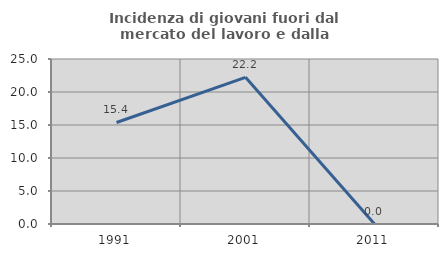
| Category | Incidenza di giovani fuori dal mercato del lavoro e dalla formazione  |
|---|---|
| 1991.0 | 15.385 |
| 2001.0 | 22.222 |
| 2011.0 | 0 |